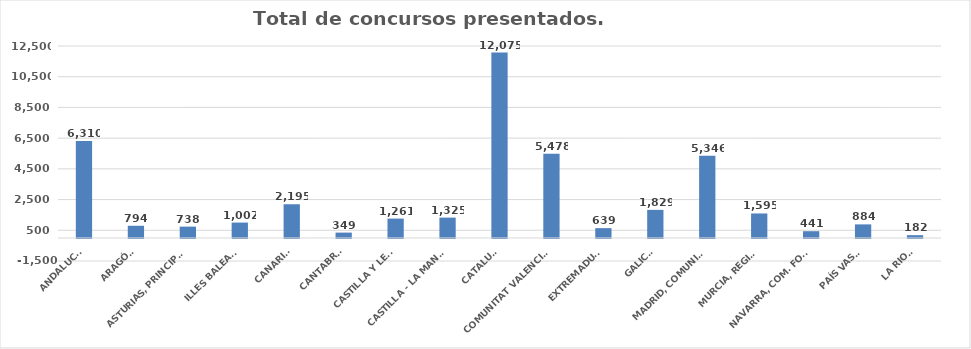
| Category | Series 0 |
|---|---|
| ANDALUCÍA | 6310 |
| ARAGÓN | 794 |
| ASTURIAS, PRINCIPADO | 738 |
| ILLES BALEARS | 1002 |
| CANARIAS | 2195 |
| CANTABRIA | 349 |
| CASTILLA Y LEÓN | 1261 |
| CASTILLA - LA MANCHA | 1325 |
| CATALUÑA | 12075 |
| COMUNITAT VALENCIANA | 5478 |
| EXTREMADURA | 639 |
| GALICIA | 1829 |
| MADRID, COMUNIDAD | 5346 |
| MURCIA, REGIÓN | 1595 |
| NAVARRA, COM. FORAL | 441 |
| PAÍS VASCO | 884 |
| LA RIOJA | 182 |